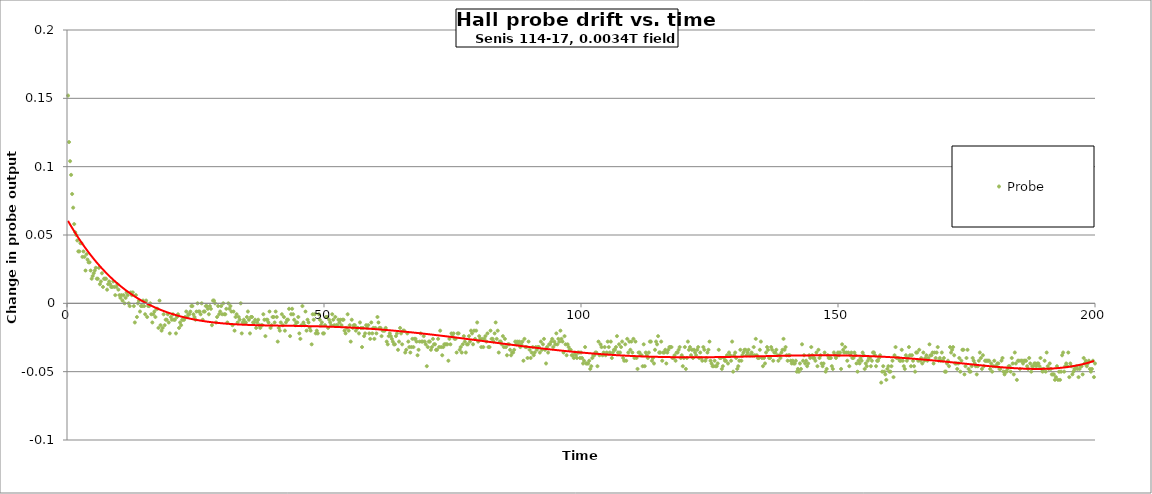
| Category | Probe |
|---|---|
| 0.2 | 0.152 |
| 0.4 | 0.118 |
| 0.6000000000000001 | 0.104 |
| 0.8 | 0.094 |
| 1.0 | 0.08 |
| 1.2 | 0.07 |
| 1.4 | 0.058 |
| 1.5999999999999999 | 0.052 |
| 1.7999999999999998 | 0.05 |
| 1.9999999999999998 | 0.046 |
| 2.1999999999999997 | 0.038 |
| 2.4 | 0.038 |
| 2.6 | 0.044 |
| 2.8000000000000003 | 0.044 |
| 3.0000000000000004 | 0.034 |
| 3.2000000000000006 | 0.038 |
| 3.400000000000001 | 0.034 |
| 3.600000000000001 | 0.024 |
| 3.800000000000001 | 0.036 |
| 4.000000000000001 | 0.032 |
| 4.200000000000001 | 0.03 |
| 4.400000000000001 | 0.03 |
| 4.600000000000001 | 0.024 |
| 4.800000000000002 | 0.018 |
| 5.000000000000002 | 0.02 |
| 5.200000000000002 | 0.022 |
| 5.400000000000002 | 0.024 |
| 5.600000000000002 | 0.026 |
| 5.8000000000000025 | 0.018 |
| 6.000000000000003 | 0.018 |
| 6.200000000000003 | 0.026 |
| 6.400000000000003 | 0.014 |
| 6.600000000000003 | 0.016 |
| 6.800000000000003 | 0.022 |
| 7.0000000000000036 | 0.012 |
| 7.200000000000004 | 0.018 |
| 7.400000000000004 | 0.018 |
| 7.600000000000004 | 0.018 |
| 7.800000000000004 | 0.01 |
| 8.000000000000004 | 0.014 |
| 8.200000000000003 | 0.016 |
| 8.400000000000002 | 0.014 |
| 8.600000000000001 | 0.012 |
| 8.8 | 0.012 |
| 9.0 | 0.016 |
| 9.2 | 0.012 |
| 9.399999999999999 | 0.006 |
| 9.599999999999998 | 0.012 |
| 9.799999999999997 | 0.014 |
| 9.999999999999996 | 0.01 |
| 10.199999999999996 | 0.006 |
| 10.399999999999995 | 0.004 |
| 10.599999999999994 | 0.006 |
| 10.799999999999994 | 0.002 |
| 10.999999999999993 | 0.006 |
| 11.199999999999992 | 0 |
| 11.399999999999991 | 0.004 |
| 11.59999999999999 | 0.008 |
| 11.79999999999999 | 0.006 |
| 11.99999999999999 | 0 |
| 12.199999999999989 | -0.002 |
| 12.399999999999988 | 0.008 |
| 12.599999999999987 | 0.006 |
| 12.799999999999986 | 0.008 |
| 12.999999999999986 | -0.002 |
| 13.199999999999985 | -0.014 |
| 13.399999999999984 | 0.006 |
| 13.599999999999984 | -0.01 |
| 13.799999999999983 | 0 |
| 13.999999999999982 | 0.002 |
| 14.199999999999982 | -0.006 |
| 14.39999999999998 | -0.002 |
| 14.59999999999998 | -0.002 |
| 14.79999999999998 | 0.002 |
| 14.999999999999979 | -0.002 |
| 15.199999999999978 | -0.008 |
| 15.399999999999977 | 0.002 |
| 15.599999999999977 | -0.01 |
| 15.799999999999976 | -0.002 |
| 15.999999999999975 | -0.002 |
| 16.199999999999974 | 0 |
| 16.399999999999974 | -0.008 |
| 16.599999999999973 | -0.014 |
| 16.799999999999972 | -0.008 |
| 16.99999999999997 | -0.006 |
| 17.19999999999997 | -0.01 |
| 17.39999999999997 | -0.004 |
| 17.59999999999997 | -0.004 |
| 17.79999999999997 | -0.018 |
| 17.999999999999968 | 0.002 |
| 18.199999999999967 | -0.016 |
| 18.399999999999967 | -0.02 |
| 18.599999999999966 | -0.018 |
| 18.799999999999965 | -0.008 |
| 18.999999999999964 | -0.016 |
| 19.199999999999964 | -0.012 |
| 19.399999999999963 | -0.012 |
| 19.599999999999962 | -0.008 |
| 19.79999999999996 | -0.014 |
| 19.99999999999996 | -0.022 |
| 20.19999999999996 | -0.01 |
| 20.39999999999996 | -0.012 |
| 20.59999999999996 | -0.008 |
| 20.799999999999958 | -0.012 |
| 20.999999999999957 | -0.012 |
| 21.199999999999957 | -0.022 |
| 21.399999999999956 | -0.01 |
| 21.599999999999955 | -0.008 |
| 21.799999999999955 | -0.018 |
| 21.999999999999954 | -0.014 |
| 22.199999999999953 | -0.016 |
| 22.399999999999952 | -0.012 |
| 22.59999999999995 | -0.012 |
| 22.79999999999995 | -0.012 |
| 22.99999999999995 | -0.01 |
| 23.19999999999995 | -0.006 |
| 23.39999999999995 | -0.01 |
| 23.599999999999948 | -0.008 |
| 23.799999999999947 | -0.008 |
| 23.999999999999947 | -0.006 |
| 24.199999999999946 | -0.002 |
| 24.399999999999945 | -0.002 |
| 24.599999999999945 | -0.008 |
| 24.799999999999944 | -0.01 |
| 24.999999999999943 | -0.012 |
| 25.199999999999942 | -0.006 |
| 25.39999999999994 | 0 |
| 25.59999999999994 | -0.006 |
| 25.79999999999994 | -0.006 |
| 25.99999999999994 | -0.008 |
| 26.19999999999994 | 0 |
| 26.399999999999938 | -0.012 |
| 26.599999999999937 | -0.006 |
| 26.799999999999937 | -0.006 |
| 26.999999999999936 | -0.002 |
| 27.199999999999935 | -0.002 |
| 27.399999999999935 | -0.004 |
| 27.599999999999934 | -0.008 |
| 27.799999999999933 | -0.002 |
| 27.999999999999932 | -0.004 |
| 28.199999999999932 | -0.016 |
| 28.39999999999993 | 0.002 |
| 28.59999999999993 | 0.002 |
| 28.79999999999993 | 0 |
| 28.99999999999993 | -0.014 |
| 29.19999999999993 | -0.01 |
| 29.399999999999928 | -0.002 |
| 29.599999999999927 | -0.008 |
| 29.799999999999926 | -0.006 |
| 29.999999999999925 | -0.002 |
| 30.199999999999925 | -0.008 |
| 30.399999999999924 | 0 |
| 30.599999999999923 | -0.008 |
| 30.799999999999923 | -0.008 |
| 30.999999999999922 | -0.004 |
| 31.19999999999992 | -0.014 |
| 31.39999999999992 | 0 |
| 31.59999999999992 | -0.004 |
| 31.79999999999992 | -0.002 |
| 31.99999999999992 | -0.006 |
| 32.19999999999992 | -0.016 |
| 32.39999999999992 | -0.006 |
| 32.59999999999992 | -0.02 |
| 32.799999999999926 | -0.01 |
| 32.99999999999993 | -0.008 |
| 33.19999999999993 | -0.014 |
| 33.399999999999935 | -0.01 |
| 33.59999999999994 | -0.012 |
| 33.79999999999994 | 0 |
| 33.99999999999994 | -0.022 |
| 34.199999999999946 | -0.014 |
| 34.39999999999995 | -0.012 |
| 34.59999999999995 | -0.014 |
| 34.799999999999955 | -0.014 |
| 34.99999999999996 | -0.01 |
| 35.19999999999996 | -0.006 |
| 35.39999999999996 | -0.012 |
| 35.599999999999966 | -0.022 |
| 35.79999999999997 | -0.01 |
| 35.99999999999997 | -0.01 |
| 36.199999999999974 | -0.014 |
| 36.39999999999998 | -0.014 |
| 36.59999999999998 | -0.012 |
| 36.79999999999998 | -0.018 |
| 36.999999999999986 | -0.014 |
| 37.19999999999999 | -0.012 |
| 37.39999999999999 | -0.016 |
| 37.599999999999994 | -0.018 |
| 37.8 | -0.016 |
| 38.0 | -0.016 |
| 38.2 | -0.008 |
| 38.400000000000006 | -0.012 |
| 38.60000000000001 | -0.024 |
| 38.80000000000001 | -0.012 |
| 39.000000000000014 | -0.012 |
| 39.20000000000002 | -0.014 |
| 39.40000000000002 | -0.006 |
| 39.60000000000002 | -0.018 |
| 39.800000000000026 | -0.016 |
| 40.00000000000003 | -0.01 |
| 40.20000000000003 | -0.01 |
| 40.400000000000034 | -0.014 |
| 40.60000000000004 | -0.006 |
| 40.80000000000004 | -0.01 |
| 41.00000000000004 | -0.028 |
| 41.200000000000045 | -0.018 |
| 41.40000000000005 | -0.02 |
| 41.60000000000005 | -0.014 |
| 41.800000000000054 | -0.008 |
| 42.00000000000006 | -0.016 |
| 42.20000000000006 | -0.01 |
| 42.40000000000006 | -0.02 |
| 42.600000000000065 | -0.014 |
| 42.80000000000007 | -0.012 |
| 43.00000000000007 | -0.012 |
| 43.200000000000074 | -0.004 |
| 43.40000000000008 | -0.024 |
| 43.60000000000008 | -0.008 |
| 43.80000000000008 | -0.004 |
| 44.000000000000085 | -0.008 |
| 44.20000000000009 | -0.012 |
| 44.40000000000009 | -0.016 |
| 44.600000000000094 | -0.014 |
| 44.8000000000001 | -0.014 |
| 45.0000000000001 | -0.01 |
| 45.2000000000001 | -0.022 |
| 45.400000000000105 | -0.026 |
| 45.60000000000011 | -0.016 |
| 45.80000000000011 | -0.002 |
| 46.000000000000114 | -0.014 |
| 46.20000000000012 | -0.016 |
| 46.40000000000012 | -0.006 |
| 46.60000000000012 | -0.02 |
| 46.800000000000125 | -0.012 |
| 47.00000000000013 | -0.014 |
| 47.20000000000013 | -0.018 |
| 47.400000000000134 | -0.02 |
| 47.600000000000136 | -0.03 |
| 47.80000000000014 | -0.008 |
| 48.00000000000014 | -0.012 |
| 48.200000000000145 | -0.008 |
| 48.40000000000015 | -0.022 |
| 48.60000000000015 | -0.02 |
| 48.80000000000015 | -0.022 |
| 49.000000000000156 | -0.008 |
| 49.20000000000016 | -0.012 |
| 49.40000000000016 | -0.016 |
| 49.600000000000165 | -0.014 |
| 49.80000000000017 | -0.022 |
| 50.00000000000017 | -0.022 |
| 50.20000000000017 | -0.016 |
| 50.400000000000176 | -0.01 |
| 50.60000000000018 | -0.01 |
| 50.80000000000018 | -0.018 |
| 51.000000000000185 | -0.012 |
| 51.20000000000019 | -0.014 |
| 51.40000000000019 | -0.016 |
| 51.60000000000019 | -0.008 |
| 51.800000000000196 | -0.012 |
| 52.0000000000002 | -0.016 |
| 52.2000000000002 | -0.01 |
| 52.400000000000205 | -0.016 |
| 52.60000000000021 | -0.016 |
| 52.80000000000021 | -0.012 |
| 53.00000000000021 | -0.014 |
| 53.200000000000216 | -0.012 |
| 53.40000000000022 | -0.016 |
| 53.60000000000022 | -0.012 |
| 53.800000000000225 | -0.012 |
| 54.00000000000023 | -0.02 |
| 54.20000000000023 | -0.022 |
| 54.40000000000023 | -0.018 |
| 54.600000000000236 | -0.008 |
| 54.80000000000024 | -0.02 |
| 55.00000000000024 | -0.016 |
| 55.200000000000244 | -0.028 |
| 55.40000000000025 | -0.012 |
| 55.60000000000025 | -0.018 |
| 55.80000000000025 | -0.016 |
| 56.000000000000256 | -0.016 |
| 56.20000000000026 | -0.02 |
| 56.40000000000026 | -0.018 |
| 56.600000000000264 | -0.018 |
| 56.80000000000027 | -0.022 |
| 57.00000000000027 | -0.014 |
| 57.20000000000027 | -0.018 |
| 57.400000000000276 | -0.032 |
| 57.60000000000028 | -0.018 |
| 57.80000000000028 | -0.024 |
| 58.000000000000284 | -0.022 |
| 58.20000000000029 | -0.016 |
| 58.40000000000029 | -0.018 |
| 58.60000000000029 | -0.016 |
| 58.800000000000296 | -0.022 |
| 59.0000000000003 | -0.026 |
| 59.2000000000003 | -0.014 |
| 59.400000000000304 | -0.022 |
| 59.60000000000031 | -0.018 |
| 59.80000000000031 | -0.026 |
| 60.00000000000031 | -0.018 |
| 60.200000000000315 | -0.022 |
| 60.40000000000032 | -0.01 |
| 60.60000000000032 | -0.014 |
| 60.800000000000324 | -0.018 |
| 61.00000000000033 | -0.018 |
| 61.20000000000033 | -0.024 |
| 61.40000000000033 | -0.02 |
| 61.600000000000335 | -0.02 |
| 61.80000000000034 | -0.02 |
| 62.00000000000034 | -0.018 |
| 62.200000000000344 | -0.028 |
| 62.40000000000035 | -0.03 |
| 62.60000000000035 | -0.024 |
| 62.80000000000035 | -0.022 |
| 63.000000000000355 | -0.024 |
| 63.20000000000036 | -0.026 |
| 63.40000000000036 | -0.028 |
| 63.600000000000364 | -0.03 |
| 63.80000000000037 | -0.03 |
| 64.00000000000037 | -0.024 |
| 64.20000000000037 | -0.022 |
| 64.40000000000038 | -0.034 |
| 64.60000000000038 | -0.028 |
| 64.80000000000038 | -0.018 |
| 65.00000000000038 | -0.022 |
| 65.20000000000039 | -0.03 |
| 65.40000000000039 | -0.02 |
| 65.60000000000039 | -0.02 |
| 65.8000000000004 | -0.036 |
| 66.0000000000004 | -0.034 |
| 66.2000000000004 | -0.022 |
| 66.4000000000004 | -0.028 |
| 66.6000000000004 | -0.032 |
| 66.80000000000041 | -0.036 |
| 67.00000000000041 | -0.032 |
| 67.20000000000041 | -0.026 |
| 67.40000000000042 | -0.032 |
| 67.60000000000042 | -0.026 |
| 67.80000000000042 | -0.026 |
| 68.00000000000043 | -0.028 |
| 68.20000000000043 | -0.038 |
| 68.40000000000043 | -0.034 |
| 68.60000000000043 | -0.028 |
| 68.80000000000044 | -0.022 |
| 69.00000000000044 | -0.028 |
| 69.20000000000044 | -0.028 |
| 69.40000000000045 | -0.024 |
| 69.60000000000045 | -0.028 |
| 69.80000000000045 | -0.03 |
| 70.00000000000045 | -0.046 |
| 70.20000000000046 | -0.032 |
| 70.40000000000046 | -0.028 |
| 70.60000000000046 | -0.028 |
| 70.80000000000047 | -0.034 |
| 71.00000000000047 | -0.032 |
| 71.20000000000047 | -0.026 |
| 71.40000000000047 | -0.03 |
| 71.60000000000048 | -0.03 |
| 71.80000000000048 | -0.034 |
| 72.00000000000048 | -0.034 |
| 72.20000000000049 | -0.026 |
| 72.40000000000049 | -0.032 |
| 72.60000000000049 | -0.02 |
| 72.8000000000005 | -0.032 |
| 73.0000000000005 | -0.038 |
| 73.2000000000005 | -0.032 |
| 73.4000000000005 | -0.03 |
| 73.6000000000005 | -0.03 |
| 73.80000000000051 | -0.03 |
| 74.00000000000051 | -0.03 |
| 74.20000000000051 | -0.042 |
| 74.40000000000052 | -0.026 |
| 74.60000000000052 | -0.03 |
| 74.80000000000052 | -0.022 |
| 75.00000000000053 | -0.024 |
| 75.20000000000053 | -0.022 |
| 75.40000000000053 | -0.026 |
| 75.60000000000053 | -0.026 |
| 75.80000000000054 | -0.036 |
| 76.00000000000054 | -0.022 |
| 76.20000000000054 | -0.022 |
| 76.40000000000055 | -0.034 |
| 76.60000000000055 | -0.032 |
| 76.80000000000055 | -0.036 |
| 77.00000000000055 | -0.03 |
| 77.20000000000056 | -0.024 |
| 77.40000000000056 | -0.028 |
| 77.60000000000056 | -0.036 |
| 77.80000000000057 | -0.03 |
| 78.00000000000057 | -0.03 |
| 78.20000000000057 | -0.024 |
| 78.40000000000057 | -0.028 |
| 78.60000000000058 | -0.02 |
| 78.80000000000058 | -0.022 |
| 79.00000000000058 | -0.03 |
| 79.20000000000059 | -0.02 |
| 79.40000000000059 | -0.026 |
| 79.60000000000059 | -0.02 |
| 79.8000000000006 | -0.014 |
| 80.0000000000006 | -0.028 |
| 80.2000000000006 | -0.024 |
| 80.4000000000006 | -0.026 |
| 80.6000000000006 | -0.032 |
| 80.80000000000061 | -0.026 |
| 81.00000000000061 | -0.032 |
| 81.20000000000061 | -0.026 |
| 81.40000000000062 | -0.024 |
| 81.60000000000062 | -0.028 |
| 81.80000000000062 | -0.022 |
| 82.00000000000063 | -0.032 |
| 82.20000000000063 | -0.032 |
| 82.40000000000063 | -0.02 |
| 82.60000000000063 | -0.026 |
| 82.80000000000064 | -0.026 |
| 83.00000000000064 | -0.028 |
| 83.20000000000064 | -0.022 |
| 83.40000000000065 | -0.014 |
| 83.60000000000065 | -0.026 |
| 83.80000000000065 | -0.02 |
| 84.00000000000065 | -0.036 |
| 84.20000000000066 | -0.028 |
| 84.40000000000066 | -0.028 |
| 84.60000000000066 | -0.03 |
| 84.80000000000067 | -0.024 |
| 85.00000000000067 | -0.032 |
| 85.20000000000067 | -0.026 |
| 85.40000000000067 | -0.032 |
| 85.60000000000068 | -0.038 |
| 85.80000000000068 | -0.03 |
| 86.00000000000068 | -0.03 |
| 86.20000000000068 | -0.034 |
| 86.40000000000069 | -0.038 |
| 86.60000000000069 | -0.036 |
| 86.8000000000007 | -0.036 |
| 87.0000000000007 | -0.034 |
| 87.2000000000007 | -0.028 |
| 87.4000000000007 | -0.03 |
| 87.6000000000007 | -0.028 |
| 87.80000000000071 | -0.03 |
| 88.00000000000071 | -0.028 |
| 88.20000000000071 | -0.032 |
| 88.40000000000072 | -0.03 |
| 88.60000000000072 | -0.028 |
| 88.80000000000072 | -0.042 |
| 89.00000000000072 | -0.026 |
| 89.20000000000073 | -0.032 |
| 89.40000000000073 | -0.032 |
| 89.60000000000073 | -0.04 |
| 89.80000000000074 | -0.028 |
| 90.00000000000074 | -0.034 |
| 90.20000000000074 | -0.04 |
| 90.40000000000074 | -0.036 |
| 90.60000000000075 | -0.032 |
| 90.80000000000075 | -0.038 |
| 91.00000000000075 | -0.036 |
| 91.20000000000076 | -0.032 |
| 91.40000000000076 | -0.034 |
| 91.60000000000076 | -0.032 |
| 91.80000000000076 | -0.032 |
| 92.00000000000077 | -0.036 |
| 92.20000000000077 | -0.028 |
| 92.40000000000077 | -0.034 |
| 92.60000000000078 | -0.03 |
| 92.80000000000078 | -0.026 |
| 93.00000000000078 | -0.034 |
| 93.20000000000078 | -0.044 |
| 93.40000000000079 | -0.032 |
| 93.60000000000079 | -0.036 |
| 93.8000000000008 | -0.03 |
| 94.0000000000008 | -0.03 |
| 94.2000000000008 | -0.028 |
| 94.4000000000008 | -0.026 |
| 94.6000000000008 | -0.032 |
| 94.80000000000081 | -0.028 |
| 95.00000000000081 | -0.03 |
| 95.20000000000081 | -0.022 |
| 95.40000000000082 | -0.03 |
| 95.60000000000082 | -0.026 |
| 95.80000000000082 | -0.028 |
| 96.00000000000082 | -0.02 |
| 96.20000000000083 | -0.026 |
| 96.40000000000083 | -0.028 |
| 96.60000000000083 | -0.036 |
| 96.80000000000084 | -0.024 |
| 97.00000000000084 | -0.03 |
| 97.20000000000084 | -0.038 |
| 97.40000000000084 | -0.03 |
| 97.60000000000085 | -0.032 |
| 97.80000000000085 | -0.034 |
| 98.00000000000085 | -0.034 |
| 98.20000000000086 | -0.038 |
| 98.40000000000086 | -0.038 |
| 98.60000000000086 | -0.04 |
| 98.80000000000086 | -0.036 |
| 99.00000000000087 | -0.038 |
| 99.20000000000087 | -0.04 |
| 99.40000000000087 | -0.036 |
| 99.60000000000088 | -0.036 |
| 99.80000000000088 | -0.04 |
| 100.00000000000088 | -0.036 |
| 100.20000000000088 | -0.04 |
| 100.40000000000089 | -0.044 |
| 100.60000000000089 | -0.042 |
| 100.80000000000089 | -0.032 |
| 101.0000000000009 | -0.044 |
| 101.2000000000009 | -0.044 |
| 101.4000000000009 | -0.044 |
| 101.6000000000009 | -0.042 |
| 101.8000000000009 | -0.048 |
| 102.00000000000091 | -0.046 |
| 102.20000000000091 | -0.04 |
| 102.40000000000092 | -0.038 |
| 102.60000000000092 | -0.038 |
| 102.80000000000092 | -0.036 |
| 103.00000000000092 | -0.036 |
| 103.20000000000093 | -0.046 |
| 103.40000000000093 | -0.028 |
| 103.60000000000093 | -0.038 |
| 103.80000000000094 | -0.03 |
| 104.00000000000094 | -0.032 |
| 104.20000000000094 | -0.038 |
| 104.40000000000094 | -0.036 |
| 104.60000000000095 | -0.032 |
| 104.80000000000095 | -0.038 |
| 105.00000000000095 | -0.036 |
| 105.20000000000095 | -0.028 |
| 105.40000000000096 | -0.032 |
| 105.60000000000096 | -0.036 |
| 105.80000000000096 | -0.028 |
| 106.00000000000097 | -0.04 |
| 106.20000000000097 | -0.036 |
| 106.40000000000097 | -0.034 |
| 106.60000000000097 | -0.034 |
| 106.80000000000098 | -0.032 |
| 107.00000000000098 | -0.024 |
| 107.20000000000098 | -0.036 |
| 107.40000000000099 | -0.03 |
| 107.60000000000099 | -0.036 |
| 107.80000000000099 | -0.032 |
| 108.000000000001 | -0.028 |
| 108.200000000001 | -0.04 |
| 108.400000000001 | -0.042 |
| 108.600000000001 | -0.03 |
| 108.800000000001 | -0.042 |
| 109.00000000000101 | -0.026 |
| 109.20000000000101 | -0.036 |
| 109.40000000000101 | -0.028 |
| 109.60000000000102 | -0.034 |
| 109.80000000000102 | -0.028 |
| 110.00000000000102 | -0.036 |
| 110.20000000000103 | -0.026 |
| 110.40000000000103 | -0.04 |
| 110.60000000000103 | -0.028 |
| 110.80000000000103 | -0.04 |
| 111.00000000000104 | -0.048 |
| 111.20000000000104 | -0.036 |
| 111.40000000000104 | -0.036 |
| 111.60000000000105 | -0.038 |
| 111.80000000000105 | -0.038 |
| 112.00000000000105 | -0.046 |
| 112.20000000000105 | -0.03 |
| 112.40000000000106 | -0.046 |
| 112.60000000000106 | -0.036 |
| 112.80000000000106 | -0.038 |
| 113.00000000000107 | -0.04 |
| 113.20000000000107 | -0.036 |
| 113.40000000000107 | -0.028 |
| 113.60000000000107 | -0.028 |
| 113.80000000000108 | -0.042 |
| 114.00000000000108 | -0.04 |
| 114.20000000000108 | -0.044 |
| 114.40000000000109 | -0.034 |
| 114.60000000000109 | -0.028 |
| 114.80000000000109 | -0.03 |
| 115.0000000000011 | -0.024 |
| 115.2000000000011 | -0.036 |
| 115.4000000000011 | -0.036 |
| 115.6000000000011 | -0.028 |
| 115.8000000000011 | -0.042 |
| 116.00000000000111 | -0.036 |
| 116.20000000000111 | -0.036 |
| 116.40000000000111 | -0.034 |
| 116.60000000000112 | -0.044 |
| 116.80000000000112 | -0.036 |
| 117.00000000000112 | -0.034 |
| 117.20000000000113 | -0.032 |
| 117.40000000000113 | -0.032 |
| 117.60000000000113 | -0.032 |
| 117.80000000000113 | -0.04 |
| 118.00000000000114 | -0.04 |
| 118.20000000000114 | -0.038 |
| 118.40000000000114 | -0.042 |
| 118.60000000000115 | -0.036 |
| 118.80000000000115 | -0.036 |
| 119.00000000000115 | -0.034 |
| 119.20000000000115 | -0.032 |
| 119.40000000000116 | -0.04 |
| 119.60000000000116 | -0.038 |
| 119.80000000000116 | -0.046 |
| 120.00000000000117 | -0.04 |
| 120.20000000000117 | -0.032 |
| 120.40000000000117 | -0.048 |
| 120.60000000000117 | -0.04 |
| 120.80000000000118 | -0.028 |
| 121.00000000000118 | -0.034 |
| 121.20000000000118 | -0.032 |
| 121.40000000000119 | -0.038 |
| 121.60000000000119 | -0.034 |
| 121.80000000000119 | -0.04 |
| 122.0000000000012 | -0.034 |
| 122.2000000000012 | -0.036 |
| 122.4000000000012 | -0.038 |
| 122.6000000000012 | -0.034 |
| 122.8000000000012 | -0.032 |
| 123.00000000000121 | -0.04 |
| 123.20000000000121 | -0.036 |
| 123.40000000000121 | -0.04 |
| 123.60000000000122 | -0.042 |
| 123.80000000000122 | -0.032 |
| 124.00000000000122 | -0.034 |
| 124.20000000000122 | -0.042 |
| 124.40000000000123 | -0.04 |
| 124.60000000000123 | -0.036 |
| 124.80000000000123 | -0.034 |
| 125.00000000000124 | -0.028 |
| 125.20000000000124 | -0.042 |
| 125.40000000000124 | -0.044 |
| 125.60000000000124 | -0.046 |
| 125.80000000000125 | -0.046 |
| 126.00000000000125 | -0.042 |
| 126.20000000000125 | -0.046 |
| 126.40000000000126 | -0.046 |
| 126.60000000000126 | -0.044 |
| 126.80000000000126 | -0.034 |
| 127.00000000000126 | -0.04 |
| 127.20000000000127 | -0.04 |
| 127.40000000000127 | -0.048 |
| 127.60000000000127 | -0.046 |
| 127.80000000000128 | -0.04 |
| 128.00000000000128 | -0.042 |
| 128.20000000000127 | -0.042 |
| 128.40000000000126 | -0.038 |
| 128.60000000000124 | -0.044 |
| 128.80000000000123 | -0.036 |
| 129.00000000000122 | -0.038 |
| 129.2000000000012 | -0.042 |
| 129.4000000000012 | -0.028 |
| 129.6000000000012 | -0.05 |
| 129.80000000000118 | -0.038 |
| 130.00000000000117 | -0.036 |
| 130.20000000000115 | -0.04 |
| 130.40000000000114 | -0.048 |
| 130.60000000000113 | -0.046 |
| 130.80000000000112 | -0.042 |
| 131.0000000000011 | -0.034 |
| 131.2000000000011 | -0.042 |
| 131.40000000000109 | -0.038 |
| 131.60000000000107 | -0.036 |
| 131.80000000000106 | -0.034 |
| 132.00000000000105 | -0.034 |
| 132.20000000000104 | -0.038 |
| 132.40000000000103 | -0.036 |
| 132.60000000000102 | -0.034 |
| 132.800000000001 | -0.038 |
| 133.000000000001 | -0.038 |
| 133.20000000000098 | -0.036 |
| 133.40000000000097 | -0.038 |
| 133.60000000000096 | -0.032 |
| 133.80000000000095 | -0.038 |
| 134.00000000000094 | -0.026 |
| 134.20000000000093 | -0.038 |
| 134.40000000000092 | -0.04 |
| 134.6000000000009 | -0.04 |
| 134.8000000000009 | -0.034 |
| 135.00000000000088 | -0.028 |
| 135.20000000000087 | -0.04 |
| 135.40000000000086 | -0.046 |
| 135.60000000000085 | -0.04 |
| 135.80000000000084 | -0.044 |
| 136.00000000000082 | -0.036 |
| 136.2000000000008 | -0.032 |
| 136.4000000000008 | -0.034 |
| 136.6000000000008 | -0.04 |
| 136.80000000000078 | -0.04 |
| 137.00000000000077 | -0.032 |
| 137.20000000000076 | -0.034 |
| 137.40000000000074 | -0.042 |
| 137.60000000000073 | -0.036 |
| 137.80000000000072 | -0.036 |
| 138.0000000000007 | -0.034 |
| 138.2000000000007 | -0.038 |
| 138.4000000000007 | -0.042 |
| 138.60000000000068 | -0.038 |
| 138.80000000000067 | -0.04 |
| 139.00000000000065 | -0.036 |
| 139.20000000000064 | -0.034 |
| 139.40000000000063 | -0.026 |
| 139.60000000000062 | -0.034 |
| 139.8000000000006 | -0.032 |
| 140.0000000000006 | -0.038 |
| 140.20000000000059 | -0.042 |
| 140.40000000000057 | -0.038 |
| 140.60000000000056 | -0.038 |
| 140.80000000000055 | -0.042 |
| 141.00000000000054 | -0.044 |
| 141.20000000000053 | -0.042 |
| 141.40000000000052 | -0.044 |
| 141.6000000000005 | -0.044 |
| 141.8000000000005 | -0.042 |
| 142.00000000000048 | -0.05 |
| 142.20000000000047 | -0.048 |
| 142.40000000000046 | -0.05 |
| 142.60000000000045 | -0.044 |
| 142.80000000000044 | -0.048 |
| 143.00000000000043 | -0.03 |
| 143.20000000000041 | -0.042 |
| 143.4000000000004 | -0.038 |
| 143.6000000000004 | -0.044 |
| 143.80000000000038 | -0.042 |
| 144.00000000000037 | -0.046 |
| 144.20000000000036 | -0.044 |
| 144.40000000000035 | -0.038 |
| 144.60000000000034 | -0.04 |
| 144.80000000000032 | -0.032 |
| 145.0000000000003 | -0.038 |
| 145.2000000000003 | -0.04 |
| 145.4000000000003 | -0.04 |
| 145.60000000000028 | -0.042 |
| 145.80000000000027 | -0.036 |
| 146.00000000000026 | -0.046 |
| 146.20000000000024 | -0.034 |
| 146.40000000000023 | -0.04 |
| 146.60000000000022 | -0.038 |
| 146.8000000000002 | -0.044 |
| 147.0000000000002 | -0.046 |
| 147.2000000000002 | -0.044 |
| 147.40000000000018 | -0.036 |
| 147.60000000000016 | -0.05 |
| 147.80000000000015 | -0.048 |
| 148.00000000000014 | -0.038 |
| 148.20000000000013 | -0.04 |
| 148.40000000000012 | -0.04 |
| 148.6000000000001 | -0.04 |
| 148.8000000000001 | -0.046 |
| 149.00000000000009 | -0.048 |
| 149.20000000000007 | -0.036 |
| 149.40000000000006 | -0.038 |
| 149.60000000000005 | -0.04 |
| 149.80000000000004 | -0.038 |
| 150.00000000000003 | -0.036 |
| 150.20000000000002 | -0.038 |
| 150.4 | -0.036 |
| 150.6 | -0.048 |
| 150.79999999999998 | -0.03 |
| 150.99999999999997 | -0.034 |
| 151.19999999999996 | -0.036 |
| 151.39999999999995 | -0.032 |
| 151.59999999999994 | -0.036 |
| 151.79999999999993 | -0.042 |
| 151.99999999999991 | -0.036 |
| 152.1999999999999 | -0.046 |
| 152.3999999999999 | -0.038 |
| 152.59999999999988 | -0.036 |
| 152.79999999999987 | -0.04 |
| 152.99999999999986 | -0.04 |
| 153.19999999999985 | -0.036 |
| 153.39999999999984 | -0.038 |
| 153.59999999999982 | -0.044 |
| 153.7999999999998 | -0.05 |
| 153.9999999999998 | -0.042 |
| 154.1999999999998 | -0.044 |
| 154.39999999999978 | -0.04 |
| 154.59999999999977 | -0.042 |
| 154.79999999999976 | -0.036 |
| 154.99999999999974 | -0.038 |
| 155.19999999999973 | -0.048 |
| 155.39999999999972 | -0.044 |
| 155.5999999999997 | -0.046 |
| 155.7999999999997 | -0.042 |
| 155.9999999999997 | -0.04 |
| 156.19999999999968 | -0.04 |
| 156.39999999999966 | -0.046 |
| 156.59999999999965 | -0.042 |
| 156.79999999999964 | -0.036 |
| 156.99999999999963 | -0.036 |
| 157.19999999999962 | -0.038 |
| 157.3999999999996 | -0.046 |
| 157.5999999999996 | -0.042 |
| 157.79999999999959 | -0.042 |
| 157.99999999999957 | -0.04 |
| 158.19999999999956 | -0.038 |
| 158.39999999999955 | -0.058 |
| 158.59999999999954 | -0.05 |
| 158.79999999999953 | -0.046 |
| 158.99999999999952 | -0.05 |
| 159.1999999999995 | -0.052 |
| 159.3999999999995 | -0.056 |
| 159.59999999999948 | -0.048 |
| 159.79999999999947 | -0.046 |
| 159.99999999999946 | -0.05 |
| 160.19999999999945 | -0.05 |
| 160.39999999999944 | -0.046 |
| 160.59999999999943 | -0.042 |
| 160.79999999999941 | -0.054 |
| 160.9999999999994 | -0.038 |
| 161.1999999999994 | -0.032 |
| 161.39999999999938 | -0.04 |
| 161.59999999999937 | -0.04 |
| 161.79999999999936 | -0.04 |
| 161.99999999999935 | -0.042 |
| 162.19999999999933 | -0.042 |
| 162.39999999999932 | -0.034 |
| 162.5999999999993 | -0.042 |
| 162.7999999999993 | -0.046 |
| 162.9999999999993 | -0.048 |
| 163.19999999999928 | -0.038 |
| 163.39999999999927 | -0.042 |
| 163.59999999999926 | -0.04 |
| 163.79999999999924 | -0.032 |
| 163.99999999999923 | -0.038 |
| 164.19999999999922 | -0.046 |
| 164.3999999999992 | -0.038 |
| 164.5999999999992 | -0.042 |
| 164.7999999999992 | -0.046 |
| 164.99999999999918 | -0.05 |
| 165.19999999999916 | -0.036 |
| 165.39999999999915 | -0.036 |
| 165.59999999999914 | -0.042 |
| 165.79999999999913 | -0.034 |
| 165.99999999999912 | -0.042 |
| 166.1999999999991 | -0.04 |
| 166.3999999999991 | -0.044 |
| 166.59999999999908 | -0.036 |
| 166.79999999999907 | -0.042 |
| 166.99999999999906 | -0.04 |
| 167.19999999999905 | -0.038 |
| 167.39999999999904 | -0.042 |
| 167.59999999999903 | -0.04 |
| 167.79999999999902 | -0.03 |
| 167.999999999999 | -0.038 |
| 168.199999999999 | -0.038 |
| 168.39999999999898 | -0.036 |
| 168.59999999999897 | -0.044 |
| 168.79999999999896 | -0.036 |
| 168.99999999999895 | -0.04 |
| 169.19999999999894 | -0.036 |
| 169.39999999999893 | -0.032 |
| 169.59999999999891 | -0.042 |
| 169.7999999999989 | -0.04 |
| 169.9999999999989 | -0.042 |
| 170.19999999999888 | -0.036 |
| 170.39999999999887 | -0.042 |
| 170.59999999999886 | -0.04 |
| 170.79999999999885 | -0.05 |
| 170.99999999999883 | -0.05 |
| 171.19999999999882 | -0.044 |
| 171.3999999999988 | -0.042 |
| 171.5999999999988 | -0.046 |
| 171.7999999999988 | -0.032 |
| 171.99999999999878 | -0.036 |
| 172.19999999999877 | -0.034 |
| 172.39999999999876 | -0.032 |
| 172.59999999999874 | -0.038 |
| 172.79999999999873 | -0.044 |
| 172.99999999999872 | -0.044 |
| 173.1999999999987 | -0.048 |
| 173.3999999999987 | -0.044 |
| 173.5999999999987 | -0.04 |
| 173.79999999999868 | -0.05 |
| 173.99999999999866 | -0.042 |
| 174.19999999999865 | -0.034 |
| 174.39999999999864 | -0.034 |
| 174.59999999999863 | -0.052 |
| 174.79999999999862 | -0.046 |
| 174.9999999999986 | -0.04 |
| 175.1999999999986 | -0.034 |
| 175.39999999999858 | -0.048 |
| 175.59999999999857 | -0.05 |
| 175.79999999999856 | -0.05 |
| 175.99999999999855 | -0.046 |
| 176.19999999999854 | -0.04 |
| 176.39999999999853 | -0.042 |
| 176.59999999999852 | -0.044 |
| 176.7999999999985 | -0.046 |
| 176.9999999999985 | -0.052 |
| 177.19999999999848 | -0.046 |
| 177.39999999999847 | -0.042 |
| 177.59999999999846 | -0.036 |
| 177.79999999999845 | -0.04 |
| 177.99999999999844 | -0.048 |
| 178.19999999999843 | -0.038 |
| 178.3999999999984 | -0.046 |
| 178.5999999999984 | -0.042 |
| 178.7999999999984 | -0.042 |
| 178.99999999999838 | -0.042 |
| 179.19999999999837 | -0.042 |
| 179.39999999999836 | -0.042 |
| 179.59999999999835 | -0.048 |
| 179.79999999999833 | -0.044 |
| 179.99999999999832 | -0.05 |
| 180.1999999999983 | -0.046 |
| 180.3999999999983 | -0.042 |
| 180.5999999999983 | -0.046 |
| 180.79999999999828 | -0.046 |
| 180.99999999999827 | -0.044 |
| 181.19999999999825 | -0.044 |
| 181.39999999999824 | -0.048 |
| 181.59999999999823 | -0.048 |
| 181.79999999999822 | -0.042 |
| 181.9999999999982 | -0.04 |
| 182.1999999999982 | -0.05 |
| 182.3999999999982 | -0.052 |
| 182.59999999999818 | -0.05 |
| 182.79999999999816 | -0.05 |
| 182.99999999999815 | -0.048 |
| 183.19999999999814 | -0.046 |
| 183.39999999999813 | -0.046 |
| 183.59999999999812 | -0.05 |
| 183.7999999999981 | -0.04 |
| 183.9999999999981 | -0.044 |
| 184.19999999999808 | -0.052 |
| 184.39999999999807 | -0.036 |
| 184.59999999999806 | -0.044 |
| 184.79999999999805 | -0.056 |
| 184.99999999999804 | -0.042 |
| 185.19999999999803 | -0.042 |
| 185.39999999999802 | -0.048 |
| 185.599999999998 | -0.042 |
| 185.799999999998 | -0.042 |
| 185.99999999999798 | -0.044 |
| 186.19999999999797 | -0.042 |
| 186.39999999999796 | -0.042 |
| 186.59999999999795 | -0.042 |
| 186.79999999999794 | -0.046 |
| 186.99999999999793 | -0.048 |
| 187.1999999999979 | -0.04 |
| 187.3999999999979 | -0.044 |
| 187.5999999999979 | -0.05 |
| 187.79999999999788 | -0.046 |
| 187.99999999999787 | -0.046 |
| 188.19999999999786 | -0.044 |
| 188.39999999999785 | -0.044 |
| 188.59999999999783 | -0.046 |
| 188.79999999999782 | -0.044 |
| 188.9999999999978 | -0.044 |
| 189.1999999999978 | -0.046 |
| 189.3999999999978 | -0.04 |
| 189.59999999999778 | -0.048 |
| 189.79999999999777 | -0.05 |
| 189.99999999999775 | -0.048 |
| 190.19999999999774 | -0.042 |
| 190.39999999999773 | -0.05 |
| 190.59999999999772 | -0.036 |
| 190.7999999999977 | -0.046 |
| 190.9999999999977 | -0.048 |
| 191.1999999999977 | -0.044 |
| 191.39999999999768 | -0.048 |
| 191.59999999999766 | -0.052 |
| 191.79999999999765 | -0.052 |
| 191.99999999999764 | -0.052 |
| 192.19999999999763 | -0.056 |
| 192.39999999999762 | -0.054 |
| 192.5999999999976 | -0.046 |
| 192.7999999999976 | -0.056 |
| 192.99999999999758 | -0.05 |
| 193.19999999999757 | -0.056 |
| 193.39999999999756 | -0.05 |
| 193.59999999999755 | -0.038 |
| 193.79999999999754 | -0.036 |
| 193.99999999999753 | -0.05 |
| 194.19999999999752 | -0.046 |
| 194.3999999999975 | -0.044 |
| 194.5999999999975 | -0.046 |
| 194.79999999999748 | -0.036 |
| 194.99999999999747 | -0.054 |
| 195.19999999999746 | -0.044 |
| 195.39999999999745 | -0.046 |
| 195.59999999999744 | -0.052 |
| 195.79999999999742 | -0.05 |
| 195.9999999999974 | -0.048 |
| 196.1999999999974 | -0.048 |
| 196.3999999999974 | -0.046 |
| 196.59999999999738 | -0.048 |
| 196.79999999999737 | -0.054 |
| 196.99999999999736 | -0.048 |
| 197.19999999999735 | -0.046 |
| 197.39999999999733 | -0.046 |
| 197.59999999999732 | -0.052 |
| 197.7999999999973 | -0.04 |
| 197.9999999999973 | -0.044 |
| 198.1999999999973 | -0.042 |
| 198.39999999999728 | -0.046 |
| 198.59999999999727 | -0.044 |
| 198.79999999999725 | -0.042 |
| 198.99999999999724 | -0.048 |
| 199.19999999999723 | -0.05 |
| 199.39999999999722 | -0.048 |
| 199.5999999999972 | -0.042 |
| 199.7999999999972 | -0.054 |
| 199.9999999999972 | -0.044 |